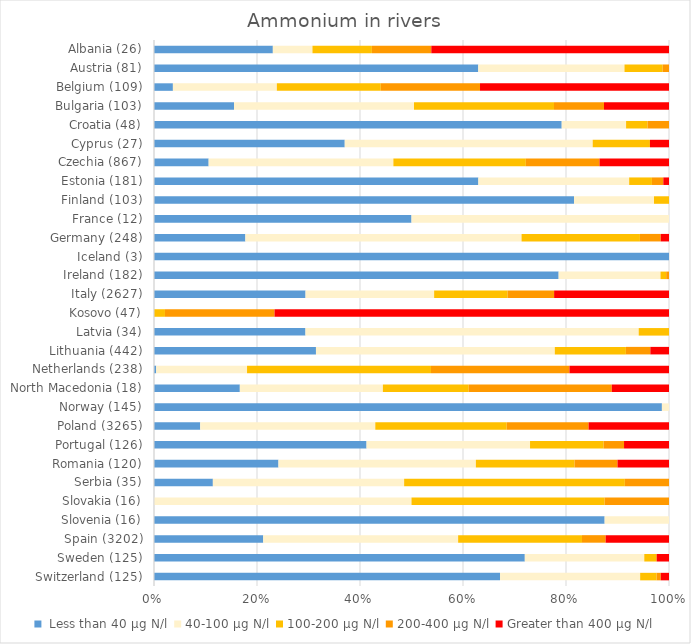
| Category |  Less than 40 µg N/l | 40-100 µg N/l | 100-200 µg N/l | 200-400 µg N/l | Greater than 400 µg N/l |
|---|---|---|---|---|---|
| Switzerland (125) | 84 | 34 | 4 | 1 | 2 |
| Sweden (125) | 90 | 29 | 3 | 0 | 3 |
| Spain (3202) | 679 | 1212 | 770 | 147 | 394 |
| Slovenia (16) | 14 | 2 | 0 | 0 | 0 |
| Slovakia (16) | 0 | 8 | 6 | 2 | 0 |
| Serbia (35) | 4 | 13 | 15 | 3 | 0 |
| Romania (120) | 29 | 46 | 23 | 10 | 12 |
| Portugal (126) | 52 | 40 | 18 | 5 | 11 |
| Poland (3265) | 293 | 1110 | 833 | 519 | 510 |
| Norway (145) | 143 | 2 | 0 | 0 | 0 |
| North Macedonia (18) | 3 | 5 | 3 | 5 | 2 |
| Netherlands (238) | 1 | 42 | 85 | 64 | 46 |
| Lithuania (442) | 139 | 205 | 61 | 21 | 16 |
| Latvia (34) | 10 | 22 | 2 | 0 | 0 |
| Kosovo (47) | 0 | 0 | 1 | 10 | 36 |
| Italy (2627) | 773 | 656 | 375 | 237 | 586 |
| Ireland (182) | 143 | 36 | 2 | 1 | 0 |
| Iceland (3) | 3 | 0 | 0 | 0 | 0 |
| Germany (248) | 44 | 133 | 57 | 10 | 4 |
| France (12) | 6 | 6 | 0 | 0 | 0 |
| Finland (103) | 84 | 16 | 3 | 0 | 0 |
| Estonia (181) | 114 | 53 | 8 | 4 | 2 |
| Czechia (867) | 92 | 311 | 223 | 124 | 117 |
| Cyprus (27) | 10 | 13 | 3 | 0 | 1 |
| Croatia (48) | 38 | 6 | 2 | 2 | 0 |
| Bulgaria (103) | 16 | 36 | 28 | 10 | 13 |
| Belgium (109) | 4 | 22 | 22 | 21 | 40 |
| Austria (81) | 51 | 23 | 6 | 1 | 0 |
| Albania (26) | 6 | 2 | 3 | 3 | 12 |